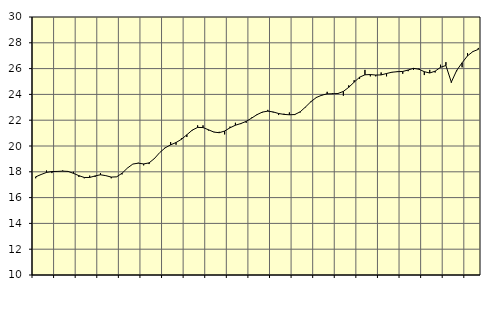
| Category | Piggar | Finansiell verksamhet, företagstjänster, SNI 64-821 |
|---|---|---|
| nan | 17.5 | 17.61 |
| 1.0 | 17.8 | 17.79 |
| 1.0 | 18.1 | 17.95 |
| 1.0 | 17.9 | 18.02 |
| nan | 18 | 18.03 |
| 2.0 | 18.1 | 18.05 |
| 2.0 | 18 | 18.03 |
| 2.0 | 18 | 17.88 |
| nan | 17.6 | 17.7 |
| 3.0 | 17.5 | 17.56 |
| 3.0 | 17.7 | 17.56 |
| 3.0 | 17.6 | 17.68 |
| nan | 17.9 | 17.77 |
| 4.0 | 17.7 | 17.7 |
| 4.0 | 17.5 | 17.59 |
| 4.0 | 17.6 | 17.61 |
| nan | 17.8 | 17.89 |
| 5.0 | 18.3 | 18.29 |
| 5.0 | 18.6 | 18.6 |
| 5.0 | 18.7 | 18.67 |
| nan | 18.5 | 18.61 |
| 6.0 | 18.6 | 18.69 |
| 6.0 | 19 | 19.03 |
| 6.0 | 19.5 | 19.5 |
| nan | 19.9 | 19.86 |
| 7.0 | 20.3 | 20.09 |
| 7.0 | 20.1 | 20.27 |
| 7.0 | 20.6 | 20.52 |
| nan | 20.7 | 20.87 |
| 8.0 | 21.2 | 21.23 |
| 8.0 | 21.6 | 21.44 |
| 8.0 | 21.6 | 21.43 |
| nan | 21.2 | 21.26 |
| 9.0 | 21.1 | 21.08 |
| 9.0 | 21.1 | 21.03 |
| 9.0 | 20.9 | 21.16 |
| nan | 21.5 | 21.41 |
| 10.0 | 21.8 | 21.61 |
| 10.0 | 21.7 | 21.74 |
| 10.0 | 21.8 | 21.91 |
| nan | 22.2 | 22.16 |
| 11.0 | 22.4 | 22.43 |
| 11.0 | 22.6 | 22.63 |
| 11.0 | 22.8 | 22.7 |
| nan | 22.6 | 22.64 |
| 12.0 | 22.4 | 22.52 |
| 12.0 | 22.5 | 22.45 |
| 12.0 | 22.6 | 22.42 |
| nan | 22.4 | 22.44 |
| 13.0 | 22.6 | 22.65 |
| 13.0 | 23 | 23.03 |
| 13.0 | 23.4 | 23.44 |
| nan | 23.8 | 23.76 |
| 14.0 | 23.9 | 23.94 |
| 14.0 | 24.2 | 24.04 |
| 14.0 | 24.1 | 24.05 |
| nan | 24.1 | 24.07 |
| 15.0 | 23.9 | 24.23 |
| 15.0 | 24.7 | 24.55 |
| 15.0 | 25.1 | 24.95 |
| nan | 25.2 | 25.33 |
| 16.0 | 25.9 | 25.52 |
| 16.0 | 25.4 | 25.54 |
| 16.0 | 25.4 | 25.5 |
| nan | 25.7 | 25.51 |
| 17.0 | 25.4 | 25.62 |
| 17.0 | 25.7 | 25.72 |
| 17.0 | 25.8 | 25.76 |
| nan | 25.6 | 25.78 |
| 18.0 | 25.8 | 25.89 |
| 18.0 | 25.9 | 26.02 |
| 18.0 | 26 | 25.95 |
| nan | 25.5 | 25.76 |
| 19.0 | 25.9 | 25.66 |
| 19.0 | 25.7 | 25.8 |
| 19.0 | 26.3 | 26.1 |
| nan | 26.5 | 26.24 |
| 20.0 | 24.9 | 24.95 |
| 20.0 | 25.8 | 25.86 |
| 20.0 | 26.1 | 26.45 |
| nan | 27.2 | 26.99 |
| 21.0 | 27.3 | 27.32 |
| 21.0 | 27.6 | 27.49 |